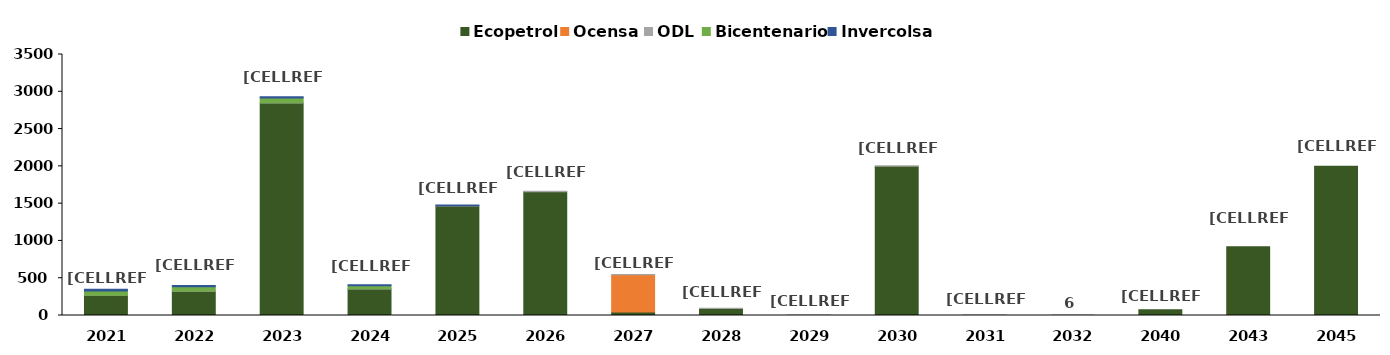
| Category | Ecopetrol | Ocensa | ODL | Bicentenario | Invercolsa |
|---|---|---|---|---|---|
| 2021.0 | 269.884 | 0 | 3.055 | 55.634 | 23.482 |
| 2022.0 | 324.533 | 0 | 3.27 | 58.023 | 17.882 |
| 2023.0 | 2851.092 | 0 | 3.499 | 60.832 | 16.479 |
| 2024.0 | 353.823 | 0 | 3.744 | 39.712 | 15.27 |
| 2025.0 | 1467.229 | 0 | 4.007 | 0 | 10.669 |
| 2026.0 | 1660.47 | 0 | 4.287 | 0 | 0 |
| 2027.0 | 45.849 | 500 | 4.588 | 0 | 0 |
| 2028.0 | 92.991 | 0 | 4.909 | 0 | 0 |
| 2029.0 | 0 | 0 | 5.254 | 0 | 0 |
| 2030.0 | 2000 | 0 | 5.622 | 0 | 0 |
| 2031.0 | 0 | 0 | 6.016 | 0 | 0 |
| 2032.0 | 0 | 0 | 5.884 | 0 | 0 |
| 2040.0 | 76.079 | 0 | 0 | 0 | 0 |
| 2043.0 | 920.366 | 0 | 0 | 0 | 0 |
| 2045.0 | 2000 | 0 | 0 | 0 | 0 |